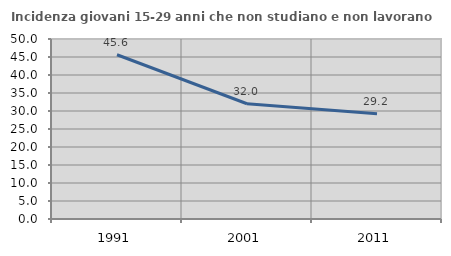
| Category | Incidenza giovani 15-29 anni che non studiano e non lavorano  |
|---|---|
| 1991.0 | 45.617 |
| 2001.0 | 32.018 |
| 2011.0 | 29.219 |